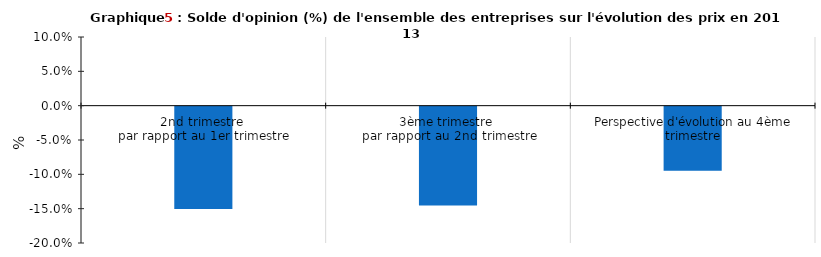
| Category |       Solde d'opinion (%) |
|---|---|
| 2nd trimestre 
par rapport au 1er trimestre | -0.149 |
| 3ème trimestre 
par rapport au 2nd trimestre | -0.144 |
| Perspective d'évolution au 4ème trimestre | -0.093 |